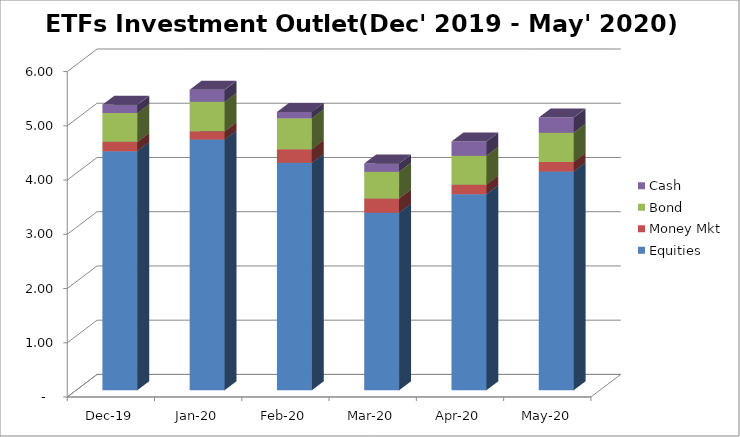
| Category | Equities | Money Mkt | Bond | Cash |
|---|---|---|---|---|
| 2019-12-01 | 4408225444.33 | 171857896.38 | 529473292.36 | 151803547.97 |
| 2020-01-01 | 4620730446.19 | 152280847.14 | 544105837.98 | 221324761.76 |
| 2020-02-01 | 4193271504.52 | 252081379.79 | 568973079.15 | 116675921.8 |
| 2020-03-01 | 3274342665.32 | 259460908.27 | 495910824.65 | 150095912.89 |
| 2020-04-01 | 3614392230.14 | 175752553.41 | 535087967.52 | 260113227.03 |
| 2020-05-01 | 4032265012.12 | 177070409.49 | 538903891.86 | 278503239.37 |